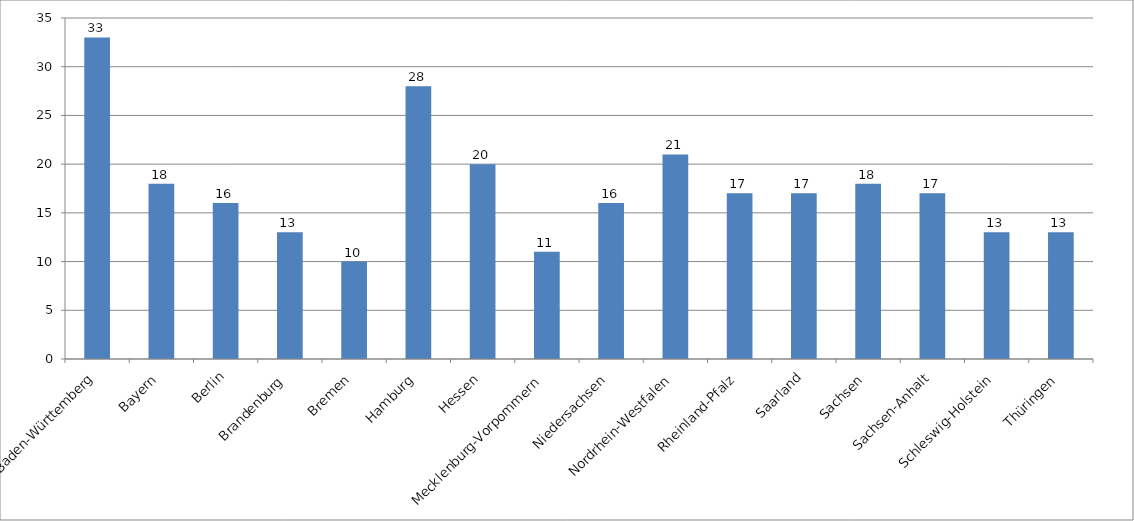
| Category | Series 0 |
|---|---|
| Baden-Württemberg | 33 |
| Bayern | 18 |
| Berlin | 16 |
| Brandenburg | 13 |
| Bremen | 10 |
| Hamburg | 28 |
| Hessen | 20 |
| Mecklenburg-Vorpommern | 11 |
| Niedersachsen | 16 |
| Nordrhein-Westfalen | 21 |
| Rheinland-Pfalz | 17 |
| Saarland | 17 |
| Sachsen | 18 |
| Sachsen-Anhalt | 17 |
| Schleswig-Holstein | 13 |
| Thüringen | 13 |